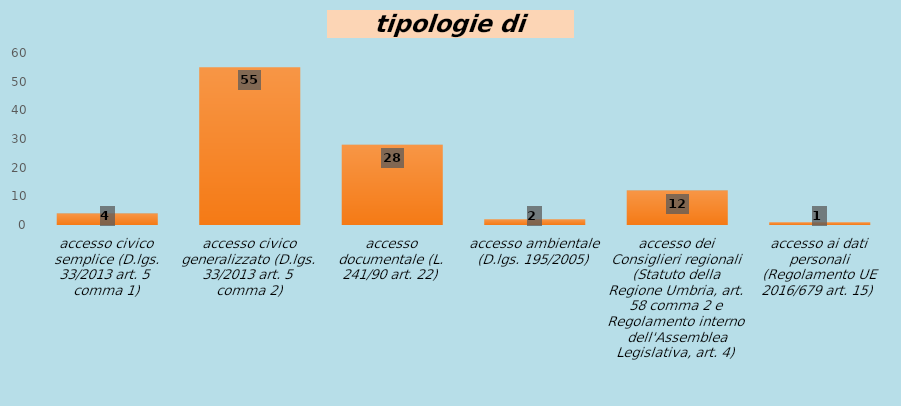
| Category | Series 0 |
|---|---|
| accesso civico semplice (D.lgs. 33/2013 art. 5 comma 1) | 4 |
| accesso civico generalizzato (D.lgs. 33/2013 art. 5 comma 2) | 55 |
| accesso documentale (L. 241/90 art. 22) | 28 |
| accesso ambientale (D.lgs. 195/2005) | 2 |
| accesso dei Consiglieri regionali
(Statuto della Regione Umbria, art. 58 comma 2 e Regolamento interno dell'Assemblea Legislativa, art. 4) | 12 |
| accesso ai dati personali (Regolamento UE 2016/679 art. 15) | 1 |